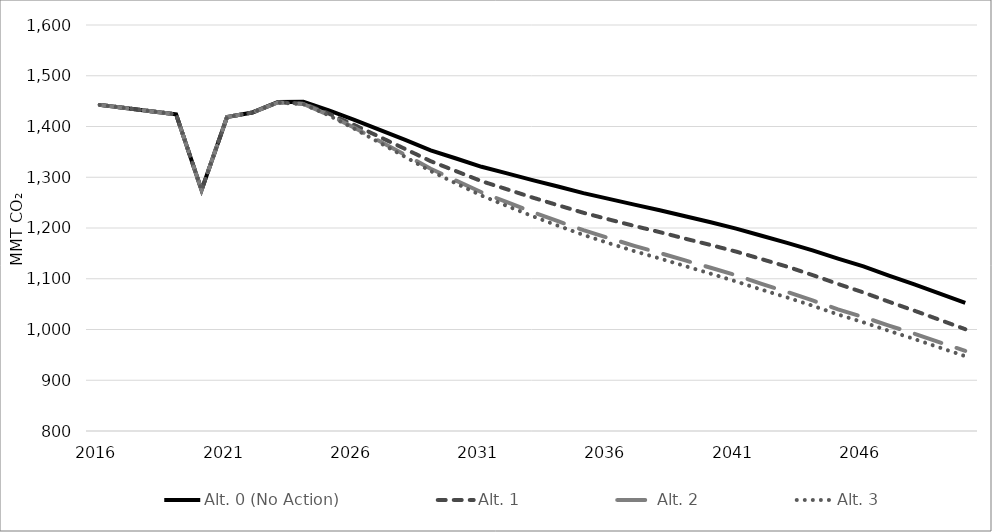
| Category | Alt. 0 (No Action) | Alt. 1 | Alt. 2 | Alt. 3 |
|---|---|---|---|---|
| 2016.0 | 1442.585 | 1442.585 | 1442.585 | 1442.585 |
| 2017.0 | 1436.387 | 1436.387 | 1436.387 | 1436.387 |
| 2018.0 | 1430.189 | 1430.189 | 1430.189 | 1430.189 |
| 2019.0 | 1423.991 | 1423.991 | 1423.991 | 1423.991 |
| 2020.0 | 1274.517 | 1274.517 | 1274.517 | 1274.517 |
| 2021.0 | 1418.525 | 1418.525 | 1418.525 | 1418.525 |
| 2022.0 | 1427.681 | 1427.681 | 1427.681 | 1427.681 |
| 2023.0 | 1448.226 | 1447.672 | 1447.305 | 1447.174 |
| 2024.0 | 1448.629 | 1445.284 | 1444.403 | 1443.93 |
| 2025.0 | 1431.878 | 1425.433 | 1422.783 | 1421.937 |
| 2026.0 | 1413.129 | 1402.969 | 1397.494 | 1395.67 |
| 2027.0 | 1393.37 | 1379.366 | 1370.787 | 1367.954 |
| 2028.0 | 1373.672 | 1355.69 | 1343.902 | 1340.109 |
| 2029.0 | 1353.14 | 1331.663 | 1316.869 | 1312.183 |
| 2030.0 | 1336.92 | 1311.948 | 1293.429 | 1287.841 |
| 2031.0 | 1320.579 | 1292.265 | 1270.263 | 1263.804 |
| 2032.0 | 1307.585 | 1276.22 | 1250.812 | 1243.381 |
| 2033.0 | 1294.275 | 1260.016 | 1231.448 | 1223.266 |
| 2034.0 | 1281.646 | 1244.882 | 1213.37 | 1204.561 |
| 2035.0 | 1268.782 | 1230.014 | 1195.744 | 1186.371 |
| 2036.0 | 1257.372 | 1216.892 | 1180.075 | 1170.067 |
| 2037.0 | 1245.976 | 1204.072 | 1164.936 | 1154.456 |
| 2038.0 | 1234.995 | 1191.884 | 1150.792 | 1139.894 |
| 2039.0 | 1223.053 | 1178.993 | 1136.09 | 1124.898 |
| 2040.0 | 1211.219 | 1166.487 | 1121.699 | 1109.992 |
| 2041.0 | 1198.777 | 1153.498 | 1106.74 | 1094.644 |
| 2042.0 | 1184.675 | 1138.629 | 1089.903 | 1078.452 |
| 2043.0 | 1170.6 | 1123.897 | 1073.99 | 1063.151 |
| 2044.0 | 1155.828 | 1107.314 | 1057.285 | 1046.839 |
| 2045.0 | 1139.771 | 1089.755 | 1039.75 | 1029.62 |
| 2046.0 | 1124.447 | 1072.998 | 1024.429 | 1014.047 |
| 2047.0 | 1106.184 | 1054.681 | 1007.812 | 997.383 |
| 2048.0 | 1088.988 | 1037.064 | 991.542 | 981.222 |
| 2049.0 | 1070.836 | 1018.966 | 974.678 | 964.254 |
| 2050.0 | 1052.479 | 1000.598 | 957.839 | 947.434 |